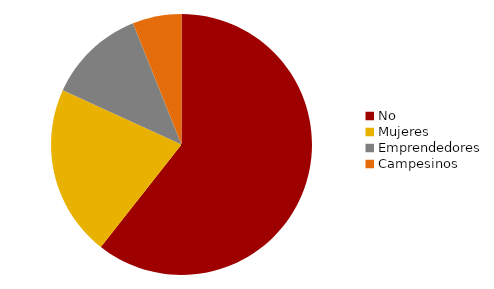
| Category | Series 0 |
|---|---|
| No | 0.606 |
| Mujeres | 0.212 |
| Emprendedores | 0.121 |
| Campesinos | 0.061 |